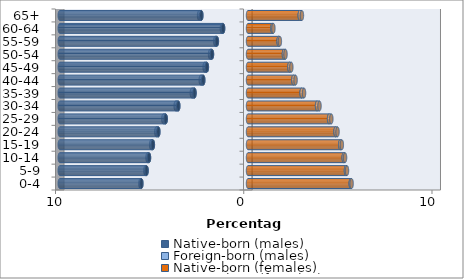
| Category | Native-born (males) | Foreign-born (males) | Native-born (females) | Foreign-born (females) |
|---|---|---|---|---|
| 0-4 | -5.664 | -0.054 | 5.457 | 0.048 |
| 5-9 | -5.388 | -0.063 | 5.203 | 0.057 |
| 10-14 | -5.259 | -0.078 | 5.084 | 0.073 |
| 15-19 | -5.054 | -0.091 | 4.899 | 0.087 |
| 20-24 | -4.762 | -0.11 | 4.651 | 0.105 |
| 25-29 | -4.371 | -0.126 | 4.306 | 0.121 |
| 30-34 | -3.703 | -0.14 | 3.667 | 0.131 |
| 35-39 | -2.841 | -0.142 | 2.847 | 0.131 |
| 40-44 | -2.376 | -0.135 | 2.409 | 0.119 |
| 45-49 | -2.184 | -0.121 | 2.198 | 0.104 |
| 50-54 | -1.914 | -0.101 | 1.909 | 0.084 |
| 55-59 | -1.652 | -0.085 | 1.624 | 0.07 |
| 60-64 | -1.322 | -0.066 | 1.297 | 0.053 |
| 65+ | -2.479 | -0.12 | 2.749 | 0.116 |